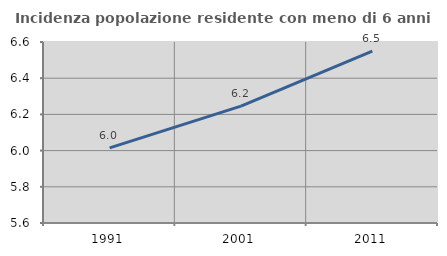
| Category | Incidenza popolazione residente con meno di 6 anni |
|---|---|
| 1991.0 | 6.015 |
| 2001.0 | 6.245 |
| 2011.0 | 6.55 |